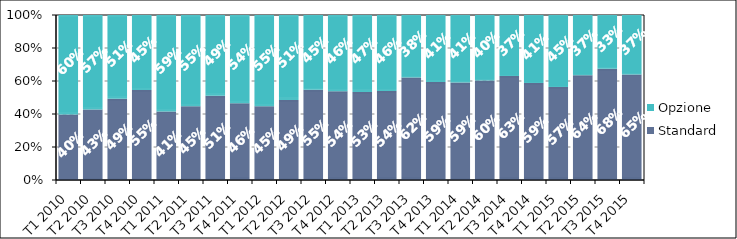
| Category | Standard | Opzione |
|---|---|---|
| T1 2010 | 0.397 | 0.603 |
| T2 2010 | 0.428 | 0.572 |
| T3 2010 | 0.492 | 0.508 |
| T4 2010 | 0.546 | 0.454 |
| T1 2011 | 0.415 | 0.585 |
| T2 2011 | 0.447 | 0.553 |
| T3 2011 | 0.511 | 0.489 |
| T4 2011 | 0.465 | 0.535 |
| T1 2012 | 0.447 | 0.553 |
| T2 2012 | 0.485 | 0.515 |
| T3 2012 | 0.548 | 0.452 |
| T4 2012 | 0.538 | 0.462 |
| T1 2013 | 0.534 | 0.466 |
| T2 2013 | 0.539 | 0.461 |
| T3 2013 | 0.621 | 0.379 |
| T4 2013 | 0.594 | 0.406 |
| T1 2014 | 0.591 | 0.409 |
| T2 2014 | 0.602 | 0.398 |
| T3 2014 | 0.63 | 0.37 |
| T4 2014 | 0.588 | 0.412 |
| T1 2015 | 0.575 | 0.446 |
| T2 2015 | 0.645 | 0.371 |
| T3 2015 | 0.682 | 0.329 |
| T4 2015 | 0.65 | 0.366 |